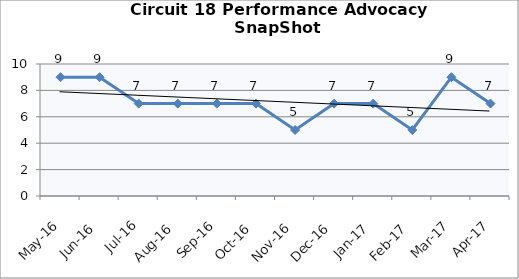
| Category | Circuit 18 |
|---|---|
| May-16 | 9 |
| Jun-16 | 9 |
| Jul-16 | 7 |
| Aug-16 | 7 |
| Sep-16 | 7 |
| Oct-16 | 7 |
| Nov-16 | 5 |
| Dec-16 | 7 |
| Jan-17 | 7 |
| Feb-17 | 5 |
| Mar-17 | 9 |
| Apr-17 | 7 |